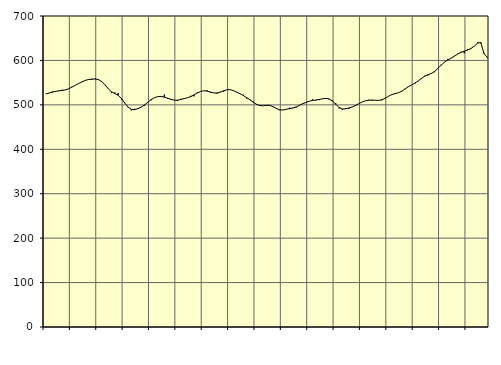
| Category | Piggar | Series 1 |
|---|---|---|
| nan | 524.6 | 524.71 |
| 87.0 | 525.9 | 526.51 |
| 87.0 | 530 | 528.54 |
| 87.0 | 529.6 | 530.32 |
| nan | 531 | 531.52 |
| 88.0 | 534 | 532.47 |
| 88.0 | 533.3 | 533.77 |
| 88.0 | 535.7 | 536.25 |
| nan | 540.6 | 540.06 |
| 89.0 | 543.9 | 544.14 |
| 89.0 | 547.3 | 547.87 |
| 89.0 | 551.5 | 551.7 |
| nan | 555.4 | 555.05 |
| 90.0 | 557.7 | 556.99 |
| 90.0 | 556.3 | 557.95 |
| 90.0 | 559.4 | 558.21 |
| nan | 557.6 | 556.9 |
| 91.0 | 551.7 | 552.66 |
| 91.0 | 545.8 | 545.16 |
| 91.0 | 535.7 | 536.21 |
| nan | 527.2 | 529.28 |
| 92.0 | 527.8 | 525.47 |
| 92.0 | 526.8 | 521.62 |
| 92.0 | 512 | 514.27 |
| nan | 504.8 | 504 |
| 93.0 | 494.2 | 494.96 |
| 93.0 | 487.6 | 489.99 |
| 93.0 | 491 | 489.26 |
| nan | 492.3 | 491.47 |
| 94.0 | 495.5 | 494.99 |
| 94.0 | 497.9 | 499.77 |
| 94.0 | 506.6 | 505.88 |
| nan | 510.1 | 511.85 |
| 95.0 | 516.1 | 516.17 |
| 95.0 | 518.6 | 518.57 |
| 95.0 | 519.1 | 518.92 |
| nan | 523.4 | 517.39 |
| 96.0 | 513.2 | 515.04 |
| 96.0 | 513.1 | 512.44 |
| 96.0 | 510.6 | 510.65 |
| nan | 508.4 | 510.54 |
| 97.0 | 513.7 | 511.96 |
| 97.0 | 514.5 | 514.11 |
| 97.0 | 515.8 | 515.91 |
| nan | 520.4 | 518.43 |
| 98.0 | 519.2 | 522.37 |
| 98.0 | 528 | 526.69 |
| 98.0 | 530.7 | 530.13 |
| nan | 531.8 | 531.71 |
| 99.0 | 532.9 | 530.93 |
| 99.0 | 527.1 | 528.75 |
| 99.0 | 526.8 | 526.88 |
| nan | 525.1 | 526.68 |
| 0.0 | 529.6 | 528.57 |
| 0.0 | 529.4 | 531.58 |
| 0.0 | 533.6 | 534.07 |
| nan | 534.5 | 534.24 |
| 1.0 | 532.2 | 531.79 |
| 1.0 | 528.8 | 528.44 |
| 1.0 | 525.3 | 525 |
| nan | 522.6 | 520.9 |
| 2.0 | 514 | 516.16 |
| 2.0 | 511.8 | 511.12 |
| 2.0 | 507.4 | 505.92 |
| nan | 500.5 | 501.24 |
| 3.0 | 498 | 498.41 |
| 3.0 | 498.2 | 498.04 |
| 3.0 | 498.1 | 498.89 |
| nan | 498.9 | 498.66 |
| 4.0 | 496.5 | 495.98 |
| 4.0 | 490.6 | 491.85 |
| 4.0 | 487.9 | 488.79 |
| nan | 488.5 | 488.38 |
| 5.0 | 490.3 | 489.98 |
| 5.0 | 493.7 | 491.57 |
| 5.0 | 493.4 | 492.95 |
| nan | 494.2 | 495.28 |
| 6.0 | 499.6 | 498.91 |
| 6.0 | 503.6 | 502.62 |
| 6.0 | 504.2 | 505.51 |
| nan | 507.9 | 508.18 |
| 7.0 | 512.3 | 510.05 |
| 7.0 | 509.9 | 511.01 |
| 7.0 | 510.5 | 512.21 |
| nan | 514.2 | 513.73 |
| 8.0 | 515.3 | 514.6 |
| 8.0 | 512.1 | 513.25 |
| 8.0 | 510.7 | 508.71 |
| nan | 503.9 | 501.49 |
| 9.0 | 491.9 | 494.07 |
| 9.0 | 488.7 | 490.74 |
| 9.0 | 492.7 | 491.1 |
| nan | 490.6 | 492.9 |
| 10.0 | 495.1 | 495.29 |
| 10.0 | 497.5 | 498.61 |
| 10.0 | 502.5 | 502.64 |
| nan | 506.4 | 506.44 |
| 11.0 | 509.6 | 509.22 |
| 11.0 | 511.5 | 510.51 |
| 11.0 | 509.2 | 510.77 |
| nan | 510.2 | 510.29 |
| 12.0 | 510.6 | 510.01 |
| 12.0 | 510.1 | 511.46 |
| 12.0 | 514.8 | 514.8 |
| nan | 519.3 | 519.31 |
| 13.0 | 522.4 | 523.06 |
| 13.0 | 526.7 | 525.22 |
| 13.0 | 527 | 527.1 |
| nan | 531.4 | 530.41 |
| 14.0 | 536.2 | 535.61 |
| 14.0 | 541.7 | 540.67 |
| 14.0 | 545.1 | 544.75 |
| nan | 547.4 | 548.81 |
| 15.0 | 553 | 553.75 |
| 15.0 | 558 | 559.44 |
| 15.0 | 565.5 | 564.38 |
| nan | 566.1 | 567.98 |
| 16.0 | 570.4 | 570.75 |
| 16.0 | 573.5 | 575.22 |
| 16.0 | 582.4 | 582.05 |
| nan | 590.6 | 589.52 |
| 17.0 | 595.4 | 596.13 |
| 17.0 | 602.9 | 601.07 |
| 17.0 | 605.4 | 605.03 |
| nan | 610.1 | 609.56 |
| 18.0 | 615 | 614.25 |
| 18.0 | 619.6 | 618.16 |
| 18.0 | 616.2 | 620.88 |
| nan | 625.5 | 623.32 |
| 19.0 | 627.9 | 626.84 |
| 19.0 | 632 | 631.77 |
| 19.0 | 640.4 | 638.84 |
| nan | 638.5 | 640.68 |
| 20.0 | 616.4 | 615.15 |
| 20.0 | 605.1 | 606.75 |